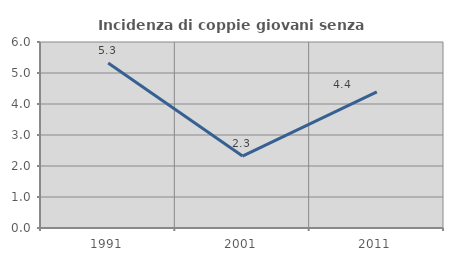
| Category | Incidenza di coppie giovani senza figli |
|---|---|
| 1991.0 | 5.322 |
| 2001.0 | 2.32 |
| 2011.0 | 4.39 |